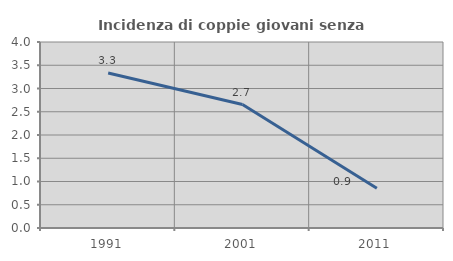
| Category | Incidenza di coppie giovani senza figli |
|---|---|
| 1991.0 | 3.333 |
| 2001.0 | 2.655 |
| 2011.0 | 0.855 |